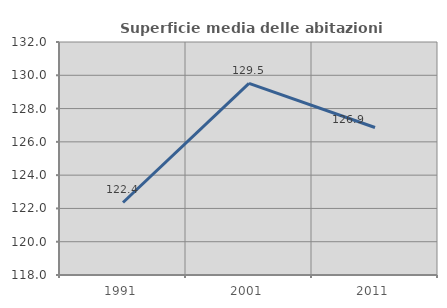
| Category | Superficie media delle abitazioni occupate |
|---|---|
| 1991.0 | 122.357 |
| 2001.0 | 129.515 |
| 2011.0 | 126.865 |